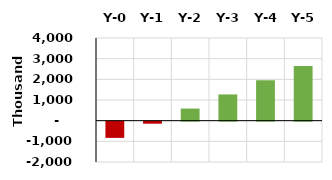
| Category | Series 0 |
|---|---|
| Y-0 | -784552 |
| Y-1 | -99667.385 |
| Y-2 | 585217.231 |
| Y-3 | 1270101.846 |
| Y-4 | 1954986.462 |
| Y-5 | 2639871.077 |